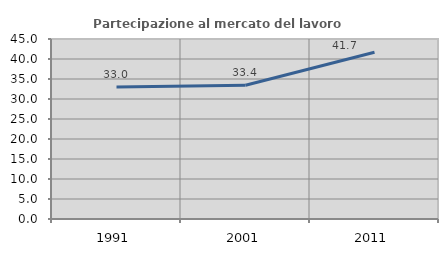
| Category | Partecipazione al mercato del lavoro  femminile |
|---|---|
| 1991.0 | 32.996 |
| 2001.0 | 33.429 |
| 2011.0 | 41.68 |